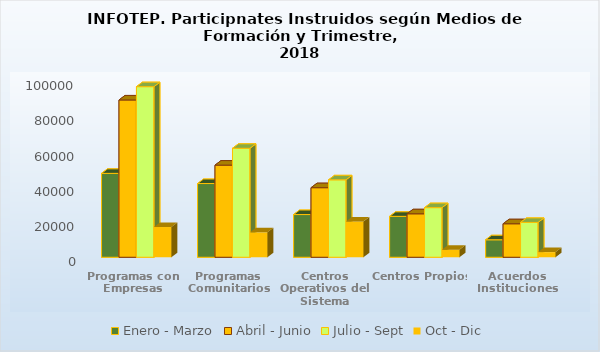
| Category | Enero - Marzo | Abril - Junio | Julio - Sept | Oct - Dic |
|---|---|---|---|---|
| Programas con Empresas | 47746 | 89521 | 97090 | 17205 |
| Programas Comunitarios | 41966 | 52444 | 62013 | 14197 |
| Centros Operativos del Sistema | 24310 | 39603 | 44062 | 20412 |
| Centros Propios | 23290 | 24738 | 28245 | 4328 |
| Acuerdos Instituciones | 9954 | 19069 | 19820 | 2923 |